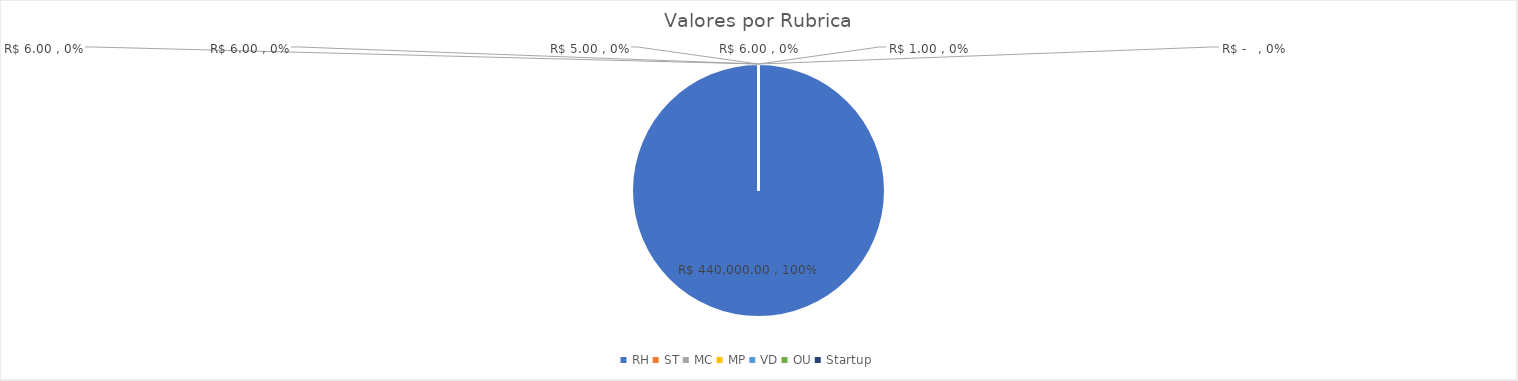
| Category | Valores |
|---|---|
| RH | 440000 |
| ST | 6 |
| MC | 6 |
| MP | 5 |
| VD | 6 |
| OU | 1 |
| Startup | 0 |